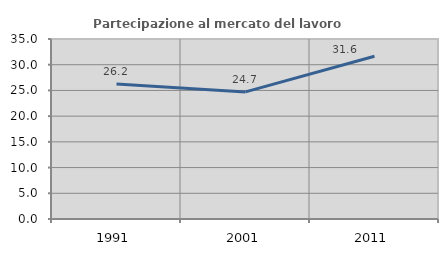
| Category | Partecipazione al mercato del lavoro  femminile |
|---|---|
| 1991.0 | 26.249 |
| 2001.0 | 24.712 |
| 2011.0 | 31.641 |